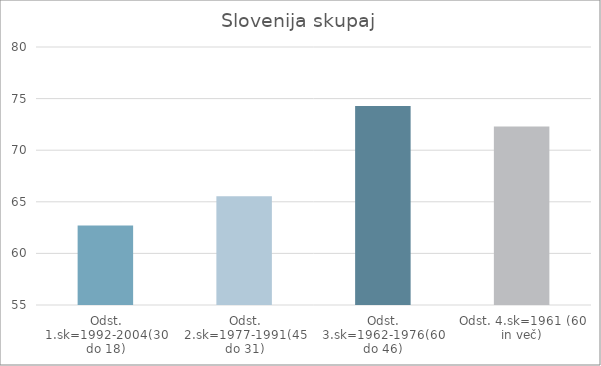
| Category | Series 0 |
|---|---|
| Odst. 1.sk=1992-2004(30 do 18) | 62.7 |
| Odst. 2.sk=1977-1991(45 do 31) | 65.53 |
| Odst. 3.sk=1962-1976(60 do 46) | 74.28 |
| Odst. 4.sk=1961 (60 in več) | 72.29 |